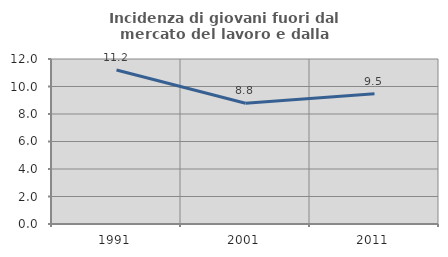
| Category | Incidenza di giovani fuori dal mercato del lavoro e dalla formazione  |
|---|---|
| 1991.0 | 11.199 |
| 2001.0 | 8.784 |
| 2011.0 | 9.469 |